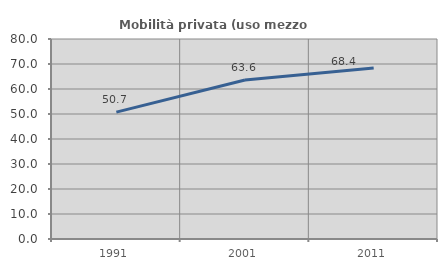
| Category | Mobilità privata (uso mezzo privato) |
|---|---|
| 1991.0 | 50.747 |
| 2001.0 | 63.585 |
| 2011.0 | 68.371 |